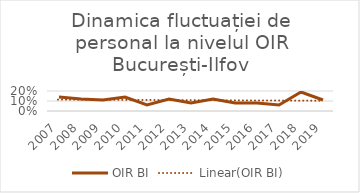
| Category | OIR BI |
|---|---|
| 2007.0 | 0.14 |
| 2008.0 | 0.12 |
| 2009.0 | 0.11 |
| 2010.0 | 0.14 |
| 2011.0 | 0.06 |
| 2012.0 | 0.12 |
| 2013.0 | 0.08 |
| 2014.0 | 0.12 |
| 2015.0 | 0.08 |
| 2016.0 | 0.08 |
| 2017.0 | 0.06 |
| 2018.0 | 0.19 |
| 2019.0 | 0.11 |